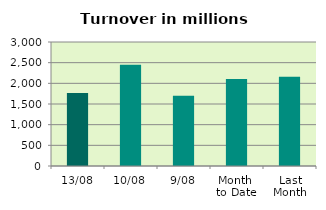
| Category | Series 0 |
|---|---|
| 13/08 | 1768.275 |
| 10/08 | 2450.701 |
| 9/08 | 1698.139 |
| Month 
to Date | 2103.932 |
| Last
Month | 2159.874 |